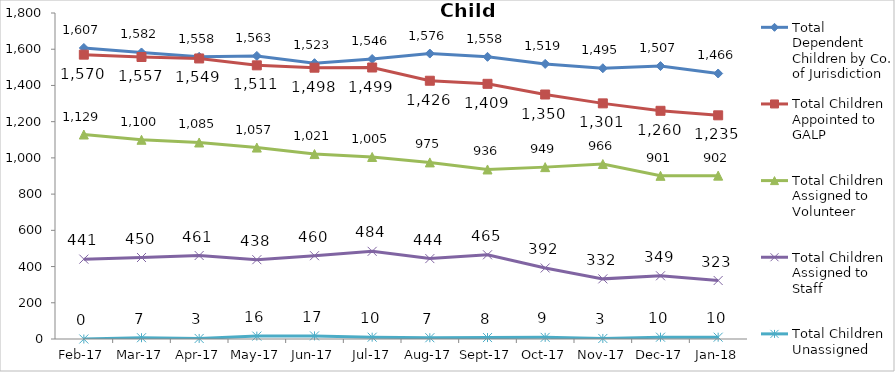
| Category | Total Dependent Children by Co. of Jurisdiction | Total Children Appointed to GALP | Total Children Assigned to Volunteer | Total Children Assigned to Staff | Total Children Unassigned |
|---|---|---|---|---|---|
| 2017-02-01 | 1607 | 1570 | 1129 | 441 | 0 |
| 2017-03-01 | 1582 | 1557 | 1100 | 450 | 7 |
| 2017-04-01 | 1558 | 1549 | 1085 | 461 | 3 |
| 2017-05-01 | 1563 | 1511 | 1057 | 438 | 16 |
| 2017-06-01 | 1523 | 1498 | 1021 | 460 | 17 |
| 2017-07-01 | 1546 | 1499 | 1005 | 484 | 10 |
| 2017-08-01 | 1576 | 1426 | 975 | 444 | 7 |
| 2017-09-01 | 1558 | 1409 | 936 | 465 | 8 |
| 2017-10-01 | 1519 | 1350 | 949 | 392 | 9 |
| 2017-11-01 | 1495 | 1301 | 966 | 332 | 3 |
| 2017-12-01 | 1507 | 1260 | 901 | 349 | 10 |
| 2018-01-01 | 1466 | 1235 | 902 | 323 | 10 |